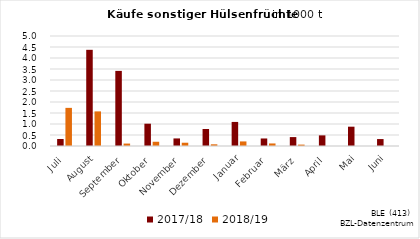
| Category | 2017/18 | 2018/19 |
|---|---|---|
| Juli | 0.317 | 1.733 |
| August | 4.372 | 1.573 |
| September | 3.414 | 0.111 |
| Oktober | 1.014 | 0.193 |
| November | 0.344 | 0.149 |
| Dezember | 0.773 | 0.077 |
| Januar | 1.094 | 0.208 |
| Februar | 0.342 | 0.116 |
| März | 0.405 | 0.063 |
| April | 0.483 | 0 |
| Mai | 0.878 | 0 |
| Juni | 0.315 | 0 |